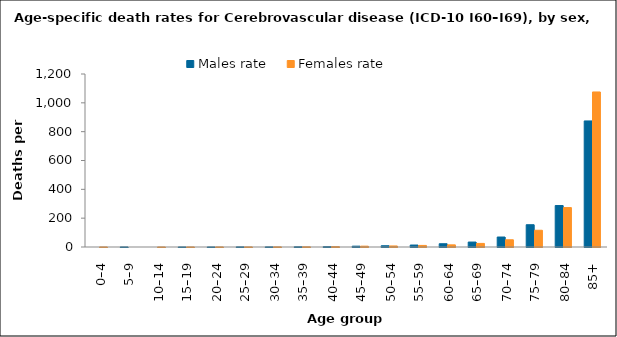
| Category | Males rate | Females rate |
|---|---|---|
| 0–4 | 0 | 0.273 |
| 5–9 | 0.361 | 0 |
| 10–14 | 0 | 0.127 |
| 15–19 | 0.262 | 0.279 |
| 20–24 | 0.239 | 0.382 |
| 25–29 | 0.871 | 0.553 |
| 30–34 | 0.851 | 0.938 |
| 35–39 | 1.616 | 1.384 |
| 40–44 | 2.574 | 2.743 |
| 45–49 | 5.751 | 5.764 |
| 50–54 | 8.688 | 7.218 |
| 55–59 | 13.639 | 10.914 |
| 60–64 | 22.638 | 14.857 |
| 65–69 | 34.33 | 24.902 |
| 70–74 | 69.228 | 50.162 |
| 75–79 | 154.444 | 116.131 |
| 80–84 | 287.644 | 273.485 |
| 85+ | 874.45 | 1075.457 |